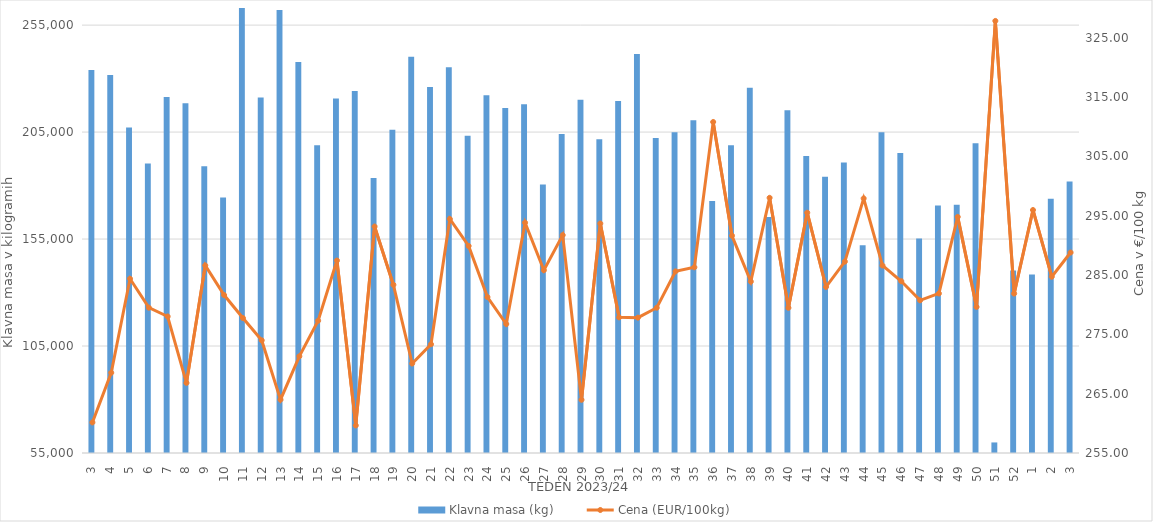
| Category | Klavna masa (kg) |
|---|---|
| 3.0 | 234042 |
| 4.0 | 231737 |
| 5.0 | 207136 |
| 6.0 | 190311 |
| 7.0 | 221366 |
| 8.0 | 218470 |
| 9.0 | 189006 |
| 10.0 | 174425 |
| 11.0 | 265476 |
| 12.0 | 221171 |
| 13.0 | 262102 |
| 14.0 | 237813 |
| 15.0 | 198828 |
| 16.0 | 220686 |
| 17.0 | 224192 |
| 18.0 | 183508 |
| 19.0 | 206133 |
| 20.0 | 240223 |
| 21.0 | 226050 |
| 22.0 | 235273 |
| 23.0 | 203306 |
| 24.0 | 222178 |
| 25.0 | 216259 |
| 26.0 | 218064 |
| 27.0 | 180556 |
| 28.0 | 204078 |
| 29.0 | 220162 |
| 30.0 | 201649 |
| 31.0 | 219538 |
| 32.0 | 241549 |
| 33.0 | 202261 |
| 34.0 | 204903 |
| 35.0 | 210575 |
| 36.0 | 172745 |
| 37.0 | 198877 |
| 38.0 | 225730 |
| 39.0 | 165273 |
| 40.0 | 215175 |
| 41.0 | 193769 |
| 42.0 | 184122 |
| 43.0 | 190834 |
| 44.0 | 152119 |
| 45.0 | 204974 |
| 46.0 | 195179 |
| 47.0 | 155300 |
| 48.0 | 170687 |
| 49.0 | 171040 |
| 50.0 | 199802 |
| 51.0 | 59936 |
| 52.0 | 140361 |
| 1.0 | 138450 |
| 2.0 | 173833 |
| 3.0 | 181907 |